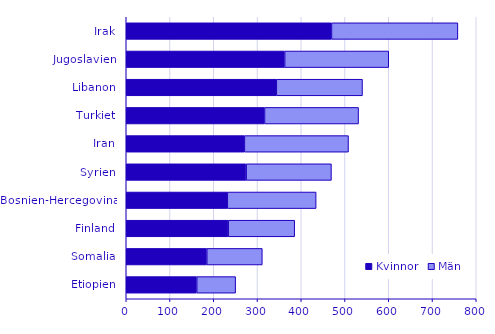
| Category | Kvinnor | Män |
|---|---|---|
| Etiopien | 161 | 89 |
| Somalia | 184 | 127 |
| Finland | 233 | 152 |
| Bosnien-Hercegovina | 231 | 203 |
| Syrien | 274 | 195 |
| Iran | 270 | 238 |
| Turkiet | 316 | 215 |
| Libanon | 343 | 197 |
| Jugoslavien | 362 | 238 |
| Irak | 469 | 289 |